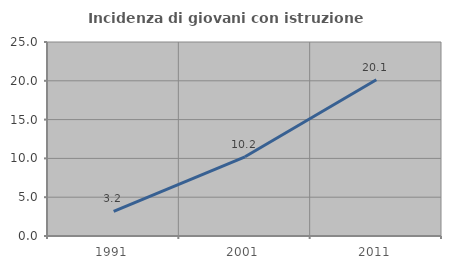
| Category | Incidenza di giovani con istruzione universitaria |
|---|---|
| 1991.0 | 3.165 |
| 2001.0 | 10.204 |
| 2011.0 | 20.126 |